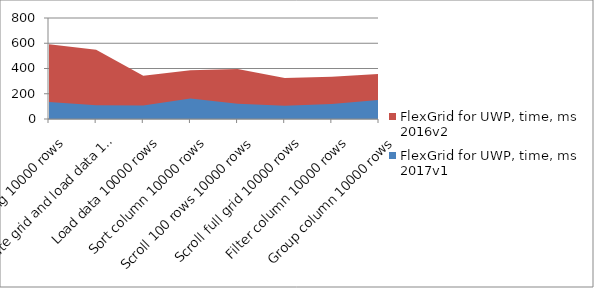
| Category | FlexGrid for UWP, time, ms 2016v2 | FlexGrid for UWP, time, ms 2017v1 |
|---|---|---|
| First loading 10000 rows | 592 | 134 |
| Create grid and load data 10000 rows | 548 | 109.6 |
| Load data 10000 rows | 342.3 | 106.6 |
| Sort column 10000 rows | 386.6 | 162.2 |
| Scroll 100 rows 10000 rows | 396.8 | 120.6 |
| Scroll full grid 10000 rows | 325.6 | 105.8 |
| Filter column 10000 rows | 335.4 | 119.4 |
| Group column 10000 rows | 357.8 | 151.9 |